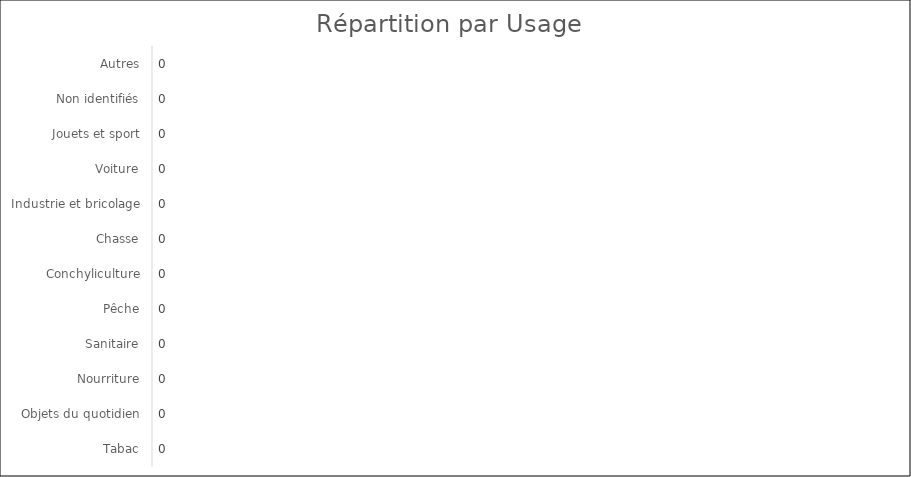
| Category | Series 0 |
|---|---|
| Tabac | 0 |
| Objets du quotidien | 0 |
| Nourriture | 0 |
| Sanitaire | 0 |
| Pêche | 0 |
| Conchyliculture | 0 |
| Chasse | 0 |
| Industrie et bricolage | 0 |
| Voiture | 0 |
| Jouets et sport | 0 |
| Non identifiés | 0 |
| Autres | 0 |